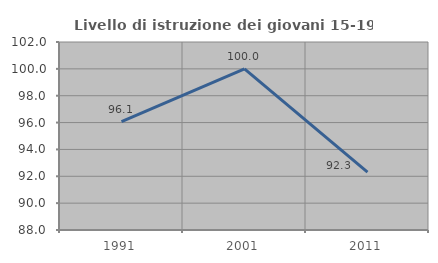
| Category | Livello di istruzione dei giovani 15-19 anni |
|---|---|
| 1991.0 | 96.078 |
| 2001.0 | 100 |
| 2011.0 | 92.308 |